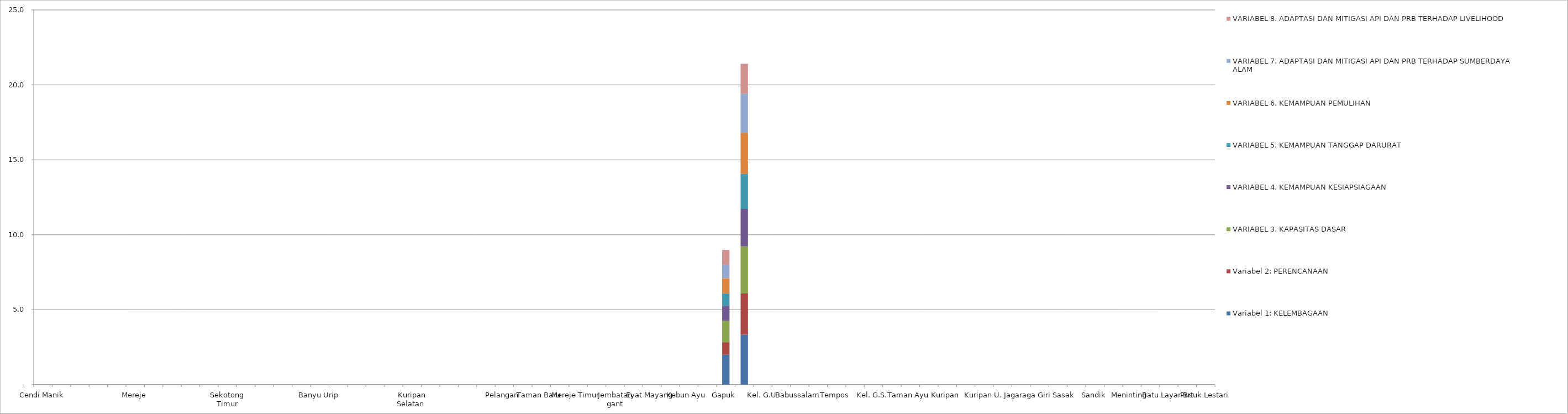
| Category | Variabel 1: KELEMBAGAAN  | Variabel 2: PERENCANAAN | VARIABEL 3. KAPASITAS DASAR  | VARIABEL 4. KEMAMPUAN KESIAPSIAGAAN  | VARIABEL 5. KEMAMPUAN TANGGAP DARURAT  | VARIABEL 6. KEMAMPUAN PEMULIHAN | VARIABEL 7. ADAPTASI DAN MITIGASI API DAN PRB TERHADAP SUMBERDAYA ALAM | VARIABEL 8. ADAPTASI DAN MITIGASI API DAN PRB TERHADAP LIVELIHOOD  |
|---|---|---|---|---|---|---|---|---|
| Cendi Manik | 0 | 0 | 0 | 0 | 0 | 0 | 0 | 0 |
|  | 0 | 0 | 0 | 0 | 0 | 0 | 0 | 0 |
|  | 0 | 0 | 0 | 0 | 0 | 0 | 0 | 0 |
|  | 0 | 0 | 0 | 0 | 0 | 0 | 0 | 0 |
|  | 0 | 0 | 0 | 0 | 0 | 0 | 0 | 0 |
| Mereje | 0 | 0 | 0 | 0 | 0 | 0 | 0 | 0 |
|  | 0 | 0 | 0 | 0 | 0 | 0 | 0 | 0 |
|  | 0 | 0 | 0 | 0 | 0 | 0 | 0 | 0 |
|  | 0 | 0 | 0 | 0 | 0 | 0 | 0 | 0 |
|  | 0 | 0 | 0 | 0 | 0 | 0 | 0 | 0 |
| Sekotong Timur | 0 | 0 | 0 | 0 | 0 | 0 | 0 | 0 |
|  | 0 | 0 | 0 | 0 | 0 | 0 | 0 | 0 |
|  | 0 | 0 | 0 | 0 | 0 | 0 | 0 | 0 |
|  | 0 | 0 | 0 | 0 | 0 | 0 | 0 | 0 |
|  | 0 | 0 | 0 | 0 | 0 | 0 | 0 | 0 |
| Banyu Urip | 0 | 0 | 0 | 0 | 0 | 0 | 0 | 0 |
|  | 0 | 0 | 0 | 0 | 0 | 0 | 0 | 0 |
|  | 0 | 0 | 0 | 0 | 0 | 0 | 0 | 0 |
|  | 0 | 0 | 0 | 0 | 0 | 0 | 0 | 0 |
|  | 0 | 0 | 0 | 0 | 0 | 0 | 0 | 0 |
| Kuripan Selatan  | 0 | 0 | 0 | 0 | 0 | 0 | 0 | 0 |
|  | 0 | 0 | 0 | 0 | 0 | 0 | 0 | 0 |
|  | 0 | 0 | 0 | 0 | 0 | 0 | 0 | 0 |
|  | 0 | 0 | 0 | 0 | 0 | 0 | 0 | 0 |
|  | 0 | 0 | 0 | 0 | 0 | 0 | 0 | 0 |
| Pelangan  | 0 | 0 | 0 | 0 | 0 | 0 | 0 | 0 |
|  | 0 | 0 | 0 | 0 | 0 | 0 | 0 | 0 |
| Taman Baru  | 0 | 0 | 0 | 0 | 0 | 0 | 0 | 0 |
|  | 0 | 0 | 0 | 0 | 0 | 0 | 0 | 0 |
| Mereje Timur  | 0 | 0 | 0 | 0 | 0 | 0 | 0 | 0 |
|  | 0 | 0 | 0 | 0 | 0 | 0 | 0 | 0 |
| Jembatan gant | 0 | 0 | 0 | 0 | 0 | 0 | 0 | 0 |
|  | 0 | 0 | 0 | 0 | 0 | 0 | 0 | 0 |
| Eyat Mayang  | 0 | 0 | 0 | 0 | 0 | 0 | 0 | 0 |
|  | 0 | 0 | 0 | 0 | 0 | 0 | 0 | 0 |
| Kebun Ayu  | 0 | 0 | 0 | 0 | 0 | 0 | 0 | 0 |
|  | 0 | 0 | 0 | 0 | 0 | 0 | 0 | 0 |
| Gapuk  | 2 | 0.833 | 1.429 | 1 | 0.833 | 1 | 0.9 | 1 |
|  | 3.333 | 2.75 | 3.143 | 2.5 | 2.333 | 2.75 | 2.6 | 2 |
| Kel. G.U | 0 | 0 | 0 | 0 | 0 | 0 | 0 | 0 |
|  | 0 | 0 | 0 | 0 | 0 | 0 | 0 | 0 |
| Babussalam  | 0 | 0 | 0 | 0 | 0 | 0 | 0 | 0 |
|  | 0 | 0 | 0 | 0 | 0 | 0 | 0 | 0 |
| Tempos  | 0 | 0 | 0 | 0 | 0 | 0 | 0 | 0 |
|  | 0 | 0 | 0 | 0 | 0 | 0 | 0 | 0 |
| Kel. G.S. | 0 | 0 | 0 | 0 | 0 | 0 | 0 | 0 |
|  | 0 | 0 | 0 | 0 | 0 | 0 | 0 | 0 |
| Taman Ayu  | 0 | 0 | 0 | 0 | 0 | 0 | 0 | 0 |
|  | 0 | 0 | 0 | 0 | 0 | 0 | 0 | 0 |
| Kuripan  | 0 | 0 | 0 | 0 | 0 | 0 | 0 | 0 |
|  | 0 | 0 | 0 | 0 | 0 | 0 | 0 | 0 |
| Kuripan U. | 0 | 0 | 0 | 0 | 0 | 0 | 0 | 0 |
|  | 0 | 0 | 0 | 0 | 0 | 0 | 0 | 0 |
| Jagaraga | 0 | 0 | 0 | 0 | 0 | 0 | 0 | 0 |
|  | 0 | 0 | 0 | 0 | 0 | 0 | 0 | 0 |
| Giri Sasak  | 0 | 0 | 0 | 0 | 0 | 0 | 0 | 0 |
|  | 0 | 0 | 0 | 0 | 0 | 0 | 0 | 0 |
| Sandik | 0 | 0 | 0 | 0 | 0 | 0 | 0 | 0 |
|  | 0 | 0 | 0 | 0 | 0 | 0 | 0 | 0 |
| Meninting  | 0 | 0 | 0 | 0 | 0 | 0 | 0 | 0 |
|  | 0 | 0 | 0 | 0 | 0 | 0 | 0 | 0 |
| Batu Layar Brt | 0 | 0 | 0 | 0 | 0 | 0 | 0 | 0 |
|  | 0 | 0 | 0 | 0 | 0 | 0 | 0 | 0 |
| Pusuk Lestari | 0 | 0 | 0 | 0 | 0 | 0 | 0 | 0 |